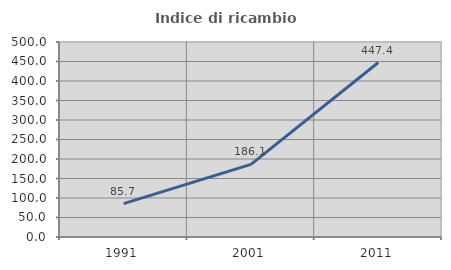
| Category | Indice di ricambio occupazionale  |
|---|---|
| 1991.0 | 85.714 |
| 2001.0 | 186.111 |
| 2011.0 | 447.368 |